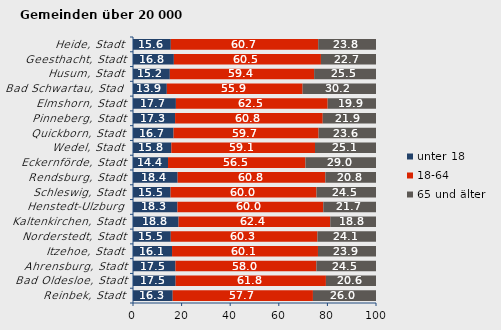
| Category | unter 18 | 18-64 | 65 und älter |
|---|---|---|---|
| Reinbek, Stadt | 16.345 | 57.704 | 25.951 |
| Bad Oldesloe, Stadt | 17.549 | 61.841 | 20.61 |
| Ahrensburg, Stadt | 17.481 | 57.985 | 24.534 |
| Itzehoe, Stadt | 16.07 | 60.051 | 23.879 |
| Norderstedt, Stadt | 15.549 | 60.346 | 24.104 |
| Kaltenkirchen, Stadt | 18.76 | 62.424 | 18.816 |
| Henstedt-Ulzburg | 18.288 | 60.03 | 21.682 |
| Schleswig, Stadt | 15.467 | 60.037 | 24.496 |
| Rendsburg, Stadt | 18.375 | 60.794 | 20.831 |
| Eckernförde, Stadt | 14.409 | 56.549 | 29.041 |
| Wedel, Stadt | 15.771 | 59.127 | 25.103 |
| Quickborn, Stadt | 16.698 | 59.674 | 23.627 |
| Pinneberg, Stadt | 17.317 | 60.767 | 21.916 |
| Elmshorn, Stadt | 17.657 | 62.451 | 19.892 |
| Bad Schwartau, Stadt | 13.917 | 55.878 | 30.205 |
| Husum, Stadt | 15.159 | 59.38 | 25.462 |
| Geesthacht, Stadt | 16.818 | 60.526 | 22.656 |
| Heide, Stadt | 15.558 | 60.657 | 23.785 |